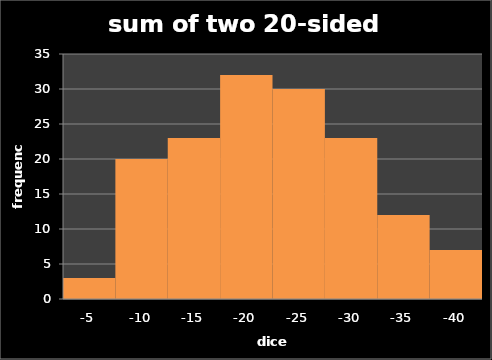
| Category | freq1 |
|---|---|
| -5.0 | 3 |
| -10.0 | 20 |
| -15.0 | 23 |
| -20.0 | 32 |
| -25.0 | 30 |
| -30.0 | 23 |
| -35.0 | 12 |
| -40.0 | 7 |